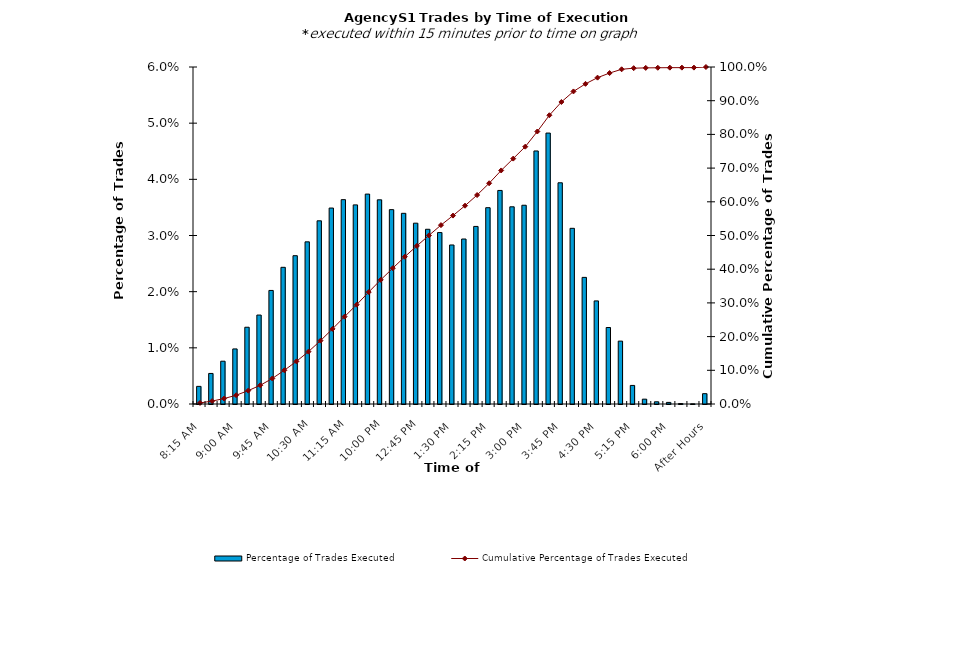
| Category | Percentage of Trades Executed |
|---|---|
| 8:15 AM | 0.003 |
| 8:30 AM | 0.005 |
| 8:45 AM | 0.008 |
| 9:00 AM | 0.01 |
| 9:15 AM | 0.014 |
| 9:30 AM | 0.016 |
| 9:45 AM | 0.02 |
| 10:00 AM | 0.024 |
| 10:15 AM | 0.026 |
| 10:30 AM | 0.029 |
| 10:45 AM | 0.033 |
| 11:00 AM | 0.035 |
| 11:15 AM | 0.036 |
| 11:30 AM | 0.035 |
| 11:45 AM | 0.037 |
| 12:00 PM | 0.036 |
| 12:15 PM | 0.035 |
| 12:30 PM | 0.034 |
| 12:45 PM | 0.032 |
| 1:00 PM | 0.031 |
| 1:15 PM | 0.031 |
| 1:30 PM | 0.028 |
| 1:45 PM | 0.029 |
| 2:00 PM | 0.032 |
| 2:15 PM | 0.035 |
| 2:30 PM | 0.038 |
| 2:45 PM | 0.035 |
| 3:00 PM | 0.035 |
| 3:15 PM | 0.045 |
| 3:30 PM | 0.048 |
| 3:45 PM | 0.039 |
| 4:00 PM | 0.031 |
| 4:15 PM | 0.023 |
| 4:30 PM | 0.018 |
| 4:45 PM | 0.014 |
| 5:00 PM | 0.011 |
| 5:15 PM | 0.003 |
| 5:30 PM | 0.001 |
| 5:45 PM | 0 |
| 6:00 PM | 0 |
| 6:15 PM | 0 |
| 6:30 PM | 0 |
| After Hours | 0.002 |